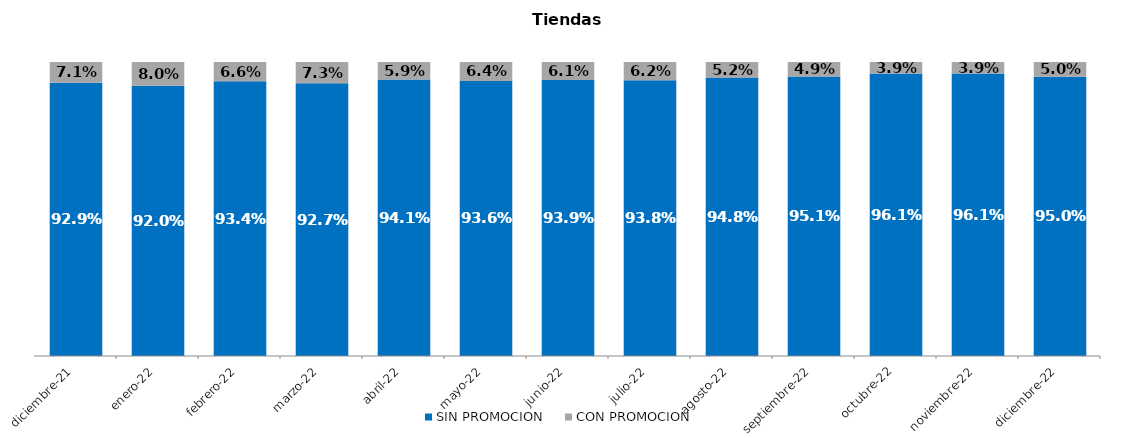
| Category | SIN PROMOCION   | CON PROMOCION   |
|---|---|---|
| 2021-12-01 | 0.929 | 0.071 |
| 2022-01-01 | 0.92 | 0.08 |
| 2022-02-01 | 0.934 | 0.066 |
| 2022-03-01 | 0.927 | 0.073 |
| 2022-04-01 | 0.941 | 0.059 |
| 2022-05-01 | 0.936 | 0.064 |
| 2022-06-01 | 0.939 | 0.061 |
| 2022-07-01 | 0.938 | 0.062 |
| 2022-08-01 | 0.948 | 0.052 |
| 2022-09-01 | 0.951 | 0.049 |
| 2022-10-01 | 0.961 | 0.039 |
| 2022-11-01 | 0.961 | 0.039 |
| 2022-12-01 | 0.95 | 0.05 |